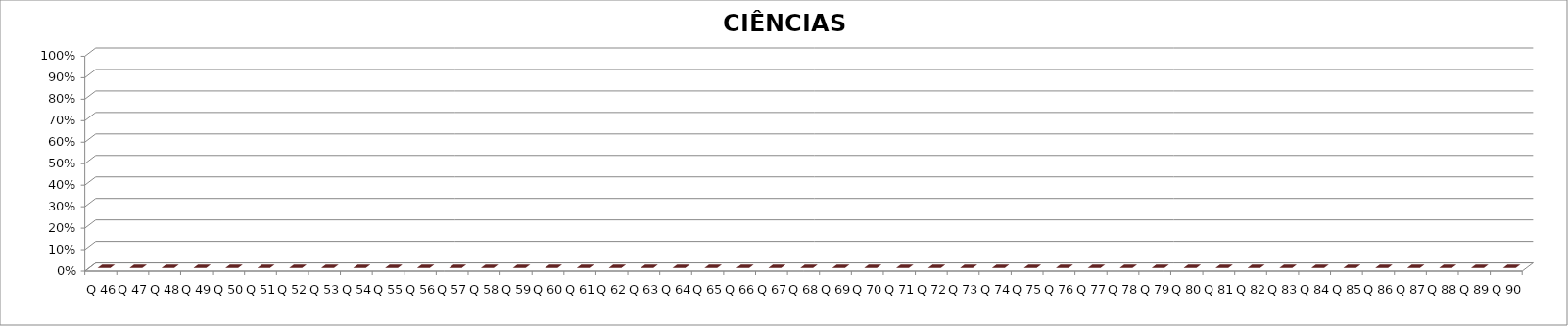
| Category | CIÊNCIAS HUMANAS |
|---|---|
| Q 46 | 0 |
| Q 47 | 0 |
| Q 48 | 0 |
| Q 49 | 0 |
| Q 50 | 0 |
| Q 51 | 0 |
| Q 52 | 0 |
| Q 53 | 0 |
| Q 54 | 0 |
| Q 55 | 0 |
| Q 56 | 0 |
| Q 57 | 0 |
| Q 58 | 0 |
| Q 59 | 0 |
| Q 60 | 0 |
| Q 61 | 0 |
| Q 62 | 0 |
| Q 63 | 0 |
| Q 64 | 0 |
| Q 65 | 0 |
| Q 66 | 0 |
| Q 67 | 0 |
| Q 68 | 0 |
| Q 69 | 0 |
| Q 70 | 0 |
| Q 71 | 0 |
| Q 72 | 0 |
| Q 73 | 0 |
| Q 74 | 0 |
| Q 75 | 0 |
| Q 76 | 0 |
| Q 77 | 0 |
| Q 78 | 0 |
| Q 79 | 0 |
| Q 80 | 0 |
| Q 81 | 0 |
| Q 82 | 0 |
| Q 83 | 0 |
| Q 84 | 0 |
| Q 85 | 0 |
| Q 86 | 0 |
| Q 87 | 0 |
| Q 88 | 0 |
| Q 89 | 0 |
| Q 90 | 0 |